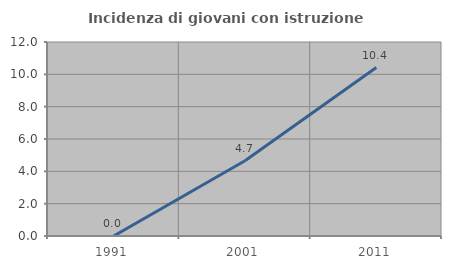
| Category | Incidenza di giovani con istruzione universitaria |
|---|---|
| 1991.0 | 0 |
| 2001.0 | 4.651 |
| 2011.0 | 10.417 |